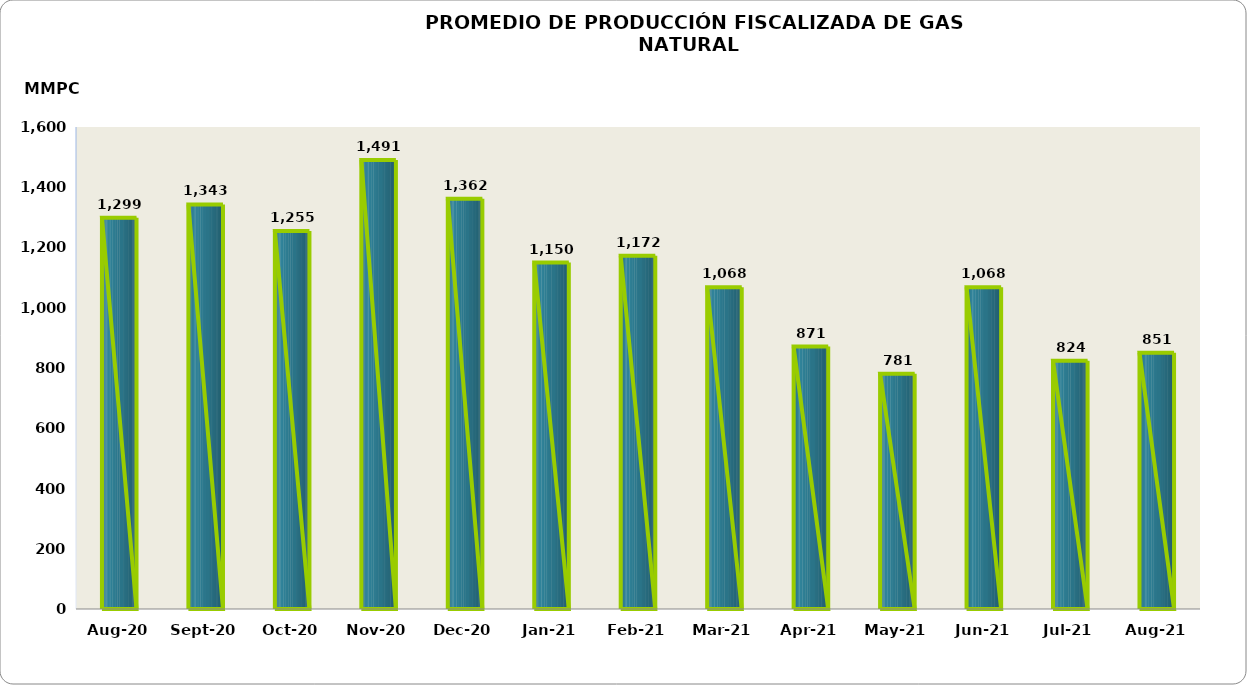
| Category | Series 0 |
|---|---|
| 2020-08-01 | 1298655.154 |
| 2020-09-01 | 1342976.236 |
| 2020-10-01 | 1254828.351 |
| 2020-11-01 | 1490754.692 |
| 2020-12-01 | 1361515.502 |
| 2021-01-01 | 1150031.71 |
| 2021-02-01 | 1172289.733 |
| 2021-03-01 | 1067744.591 |
| 2021-04-01 | 871274.072 |
| 2021-05-01 | 780865.314 |
| 2021-06-01 | 1068128.403 |
| 2021-07-01 | 823834.105 |
| 2021-08-01 | 850929.254 |